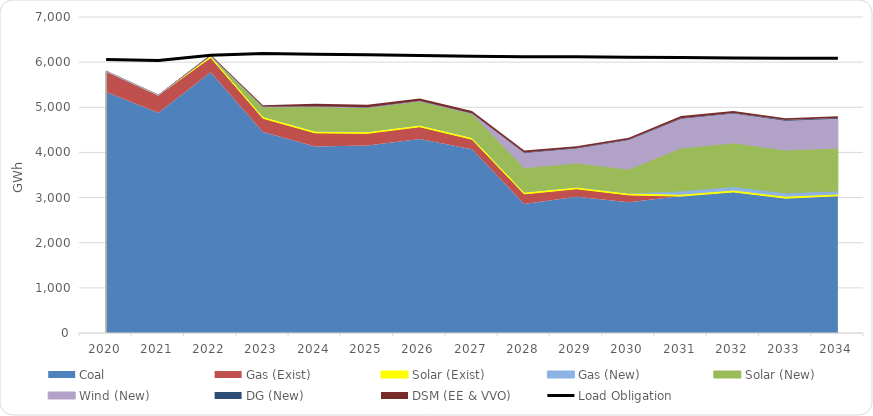
| Category | Load Obligation |
|---|---|
| 0 | 6059.919 |
| 1 | 6037.164 |
| 2 | 6155.08 |
| 3 | 6193.877 |
| 4 | 6175.223 |
| 5 | 6161.324 |
| 6 | 6145.023 |
| 7 | 6132.327 |
| 8 | 6120.566 |
| 9 | 6119.644 |
| 10 | 6108.141 |
| 11 | 6100.982 |
| 12 | 6092.381 |
| 13 | 6088.717 |
| 14 | 6084.074 |